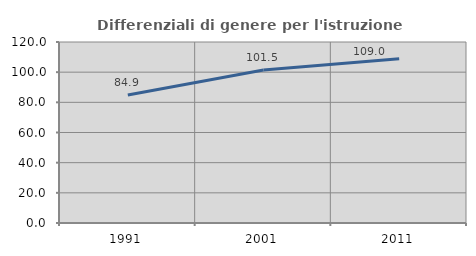
| Category | Differenziali di genere per l'istruzione superiore |
|---|---|
| 1991.0 | 84.853 |
| 2001.0 | 101.497 |
| 2011.0 | 108.953 |